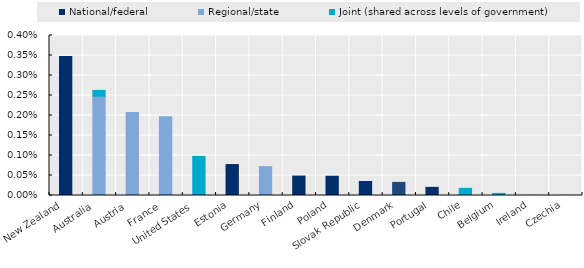
| Category | National/federal | Regional/state | Joint (shared across levels of government) |
|---|---|---|---|
| New Zealand | 0.003 | 0 | 0 |
| Australia  | 0 | 0.002 | 0 |
| Austria  | 0 | 0.002 | 0 |
| France  | 0 | 0.002 | 0 |
| United States  | 0 | 0 | 0.001 |
| Estonia | 0.001 | 0 | 0 |
| Germany  | 0 | 0.001 | 0 |
| Finland  | 0 | 0 | 0 |
| Poland | 0 | 0 | 0 |
| Slovak Republic | 0 | 0 | 0 |
| Denmark | 0 | 0 | 0 |
| Portugal | 0 | 0 | 0 |
| Chile | 0 | 0 | 0 |
| Belgium | 0 | 0 | 0 |
| Ireland | 0 | 0 | 0 |
| Czechia | 0 | 0 | 0 |